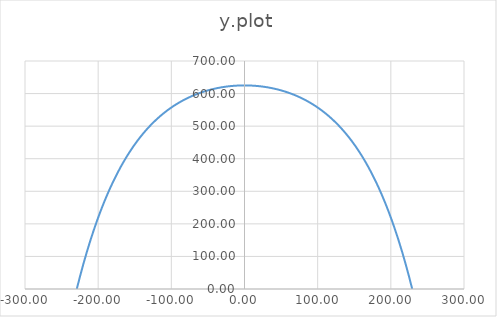
| Category | y.plot |
|---|---|
| -229.2239 | 0 |
| -224.639422 | 40.231 |
| -220.054944 | 78.105 |
| -215.47046600000002 | 113.758 |
| -210.88598800000003 | 147.319 |
| -206.30151000000004 | 178.909 |
| -201.71703200000005 | 208.642 |
| -197.13255400000006 | 236.625 |
| -192.54807600000007 | 262.959 |
| -187.96359800000008 | 287.739 |
| -183.37912000000009 | 311.054 |
| -178.7946420000001 | 332.989 |
| -174.2101640000001 | 353.622 |
| -169.62568600000012 | 373.028 |
| -165.04120800000013 | 391.278 |
| -160.45673000000014 | 408.436 |
| -155.87225200000015 | 424.564 |
| -151.28777400000016 | 439.722 |
| -146.70329600000017 | 453.963 |
| -142.11881800000018 | 467.338 |
| -137.53434000000019 | 479.897 |
| -132.9498620000002 | 491.684 |
| -128.3653840000002 | 502.742 |
| -123.7809060000002 | 513.111 |
| -119.1964280000002 | 522.828 |
| -114.61195000000019 | 531.928 |
| -110.02747200000019 | 540.444 |
| -105.44299400000018 | 548.407 |
| -100.85851600000018 | 555.845 |
| -96.27403800000017 | 562.786 |
| -91.68956000000017 | 569.254 |
| -87.10508200000017 | 575.272 |
| -82.52060400000016 | 580.863 |
| -77.93612600000016 | 586.046 |
| -73.35164800000015 | 590.84 |
| -68.76717000000015 | 595.263 |
| -64.18269200000015 | 599.33 |
| -59.59821400000015 | 603.057 |
| -55.01373600000015 | 606.456 |
| -50.429258000000154 | 609.539 |
| -45.844780000000156 | 612.319 |
| -41.26030200000016 | 614.805 |
| -36.67582400000016 | 617.005 |
| -32.091346000000165 | 618.928 |
| -27.506868000000164 | 620.581 |
| -22.922390000000163 | 621.97 |
| -18.337912000000163 | 623.1 |
| -13.753434000000162 | 623.974 |
| -9.168956000000161 | 624.596 |
| -4.5844780000001615 | 624.968 |
| -1.616484723854228e-13 | 625.092 |
| 4.584477999999838 | 624.968 |
| 9.168955999999838 | 624.596 |
| 13.753433999999839 | 623.974 |
| 18.33791199999984 | 623.1 |
| 22.92238999999984 | 621.97 |
| 27.50686799999984 | 620.581 |
| 32.09134599999984 | 618.928 |
| 36.675823999999835 | 617.005 |
| 41.26030199999983 | 614.805 |
| 45.84477999999983 | 612.319 |
| 50.42925799999983 | 609.539 |
| 55.013735999999824 | 606.456 |
| 59.59821399999982 | 603.057 |
| 64.18269199999982 | 599.33 |
| 68.76716999999982 | 595.263 |
| 73.35164799999983 | 590.84 |
| 77.93612599999983 | 586.046 |
| 82.52060399999984 | 580.863 |
| 87.10508199999984 | 575.272 |
| 91.68955999999984 | 569.254 |
| 96.27403799999985 | 562.786 |
| 100.85851599999985 | 555.845 |
| 105.44299399999986 | 548.407 |
| 110.02747199999986 | 540.444 |
| 114.61194999999987 | 531.928 |
| 119.19642799999987 | 522.828 |
| 123.78090599999987 | 513.111 |
| 128.36538399999986 | 502.742 |
| 132.94986199999985 | 491.684 |
| 137.53433999999984 | 479.897 |
| 142.11881799999983 | 467.338 |
| 146.70329599999982 | 453.963 |
| 151.2877739999998 | 439.722 |
| 155.8722519999998 | 424.564 |
| 160.4567299999998 | 408.436 |
| 165.04120799999978 | 391.278 |
| 169.62568599999977 | 373.028 |
| 174.21016399999976 | 353.622 |
| 178.79464199999975 | 332.989 |
| 183.37911999999974 | 311.054 |
| 187.96359799999973 | 287.739 |
| 192.54807599999972 | 262.959 |
| 197.13255399999971 | 236.625 |
| 201.7170319999997 | 208.642 |
| 206.3015099999997 | 178.909 |
| 210.88598799999968 | 147.319 |
| 215.47046599999967 | 113.758 |
| 220.05494399999967 | 78.105 |
| 224.63942199999966 | 40.231 |
| 229.22389999999965 | 0 |